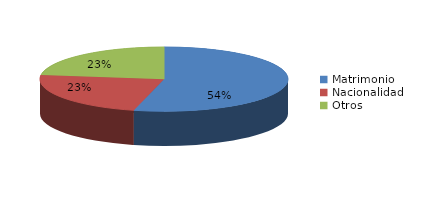
| Category | Series 0 |
|---|---|
| Matrimonio | 1720 |
| Nacionalidad | 740 |
| Otros | 731 |